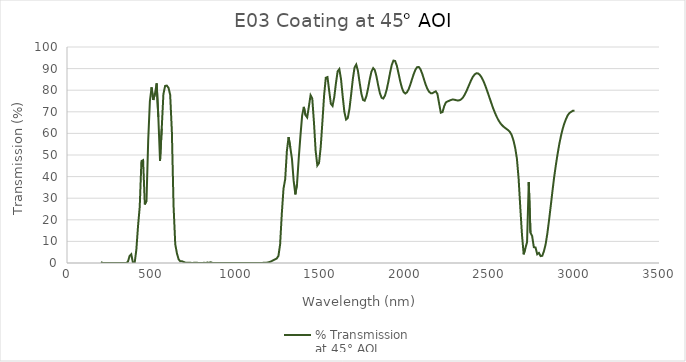
| Category | % Transmission 
at 45° AOI |
|---|---|
| 200.0 | 0.324 |
| 210.0 | 0.073 |
| 220.0 | 0.023 |
| 230.0 | 0.012 |
| 240.0 | 0.01 |
| 250.0 | 0.007 |
| 260.0 | 0.025 |
| 270.0 | 0.028 |
| 280.0 | 0.033 |
| 290.0 | 0.028 |
| 300.0 | 0.001 |
| 310.0 | 0.011 |
| 320.0 | 0.002 |
| 330.0 | 0.004 |
| 340.0 | 0.036 |
| 350.0 | 0.01 |
| 360.0 | 0.552 |
| 370.0 | 3.245 |
| 380.0 | 4.052 |
| 390.0 | 0.02 |
| 400.0 | 0.015 |
| 410.0 | 6.198 |
| 420.0 | 17.137 |
| 430.0 | 26.016 |
| 440.0 | 47.174 |
| 450.0 | 47.615 |
| 460.0 | 27.122 |
| 470.0 | 28.842 |
| 480.0 | 56.64 |
| 490.0 | 74.887 |
| 500.0 | 81.298 |
| 510.0 | 75.466 |
| 520.0 | 78.25 |
| 530.0 | 83.14 |
| 540.0 | 67.562 |
| 550.0 | 47.317 |
| 560.0 | 62.172 |
| 570.0 | 78.207 |
| 580.0 | 81.968 |
| 590.0 | 82.142 |
| 600.0 | 81.103 |
| 610.0 | 77.89 |
| 620.0 | 60.803 |
| 630.0 | 26.404 |
| 640.0 | 8.68 |
| 650.0 | 4.44 |
| 660.0 | 1.673 |
| 670.0 | 0.758 |
| 680.0 | 0.798 |
| 690.0 | 0.496 |
| 700.0 | 0.148 |
| 710.0 | 0.148 |
| 720.0 | 0.154 |
| 730.0 | 0.089 |
| 740.0 | 0.021 |
| 750.0 | 0.08 |
| 760.0 | 0.097 |
| 770.0 | 0.07 |
| 780.0 | 0.03 |
| 790.0 | 0.026 |
| 800.0 | 0.036 |
| 810.0 | 0.077 |
| 820.0 | 0.033 |
| 830.0 | 0.191 |
| 840.0 | 0.132 |
| 850.0 | 0.343 |
| 860.0 | 0.009 |
| 870.0 | 0.014 |
| 880.0 | 0.022 |
| 890.0 | 0.006 |
| 900.0 | 0.004 |
| 910.0 | 0.021 |
| 920.0 | 0.017 |
| 930.0 | 0.007 |
| 940.0 | 0.014 |
| 950.0 | 0.024 |
| 960.0 | 0.005 |
| 970.0 | 0.007 |
| 980.0 | 0.004 |
| 990.0 | 0.005 |
| 1000.0 | 0.007 |
| 1010.0 | 0.008 |
| 1020.0 | 0.008 |
| 1030.0 | 0.002 |
| 1040.0 | 0.016 |
| 1050.0 | 0.042 |
| 1060.0 | 0.031 |
| 1070.0 | 0.009 |
| 1080.0 | 0.009 |
| 1090.0 | 0.013 |
| 1100.0 | 0.014 |
| 1110.0 | 0.01 |
| 1120.0 | 0.01 |
| 1130.0 | 0.004 |
| 1140.0 | 0.013 |
| 1150.0 | 0.03 |
| 1160.0 | 0.065 |
| 1170.0 | 0.063 |
| 1180.0 | 0.149 |
| 1190.0 | 0.307 |
| 1200.0 | 0.5 |
| 1210.0 | 0.867 |
| 1220.0 | 1.297 |
| 1230.0 | 1.659 |
| 1240.0 | 2.09 |
| 1250.0 | 3.257 |
| 1260.0 | 8.653 |
| 1270.0 | 22.883 |
| 1280.0 | 34.416 |
| 1290.0 | 38.801 |
| 1300.0 | 51.844 |
| 1310.0 | 58.308 |
| 1320.0 | 53.588 |
| 1330.0 | 48.201 |
| 1340.0 | 38.112 |
| 1350.0 | 31.784 |
| 1360.0 | 36.624 |
| 1370.0 | 48.388 |
| 1380.0 | 58.756 |
| 1390.0 | 68.115 |
| 1400.0 | 72.288 |
| 1410.0 | 68.496 |
| 1420.0 | 67.382 |
| 1430.0 | 72.431 |
| 1440.0 | 77.674 |
| 1450.0 | 76.215 |
| 1460.0 | 65.184 |
| 1470.0 | 51.939 |
| 1480.0 | 45.139 |
| 1490.0 | 46.27 |
| 1500.0 | 53.688 |
| 1510.0 | 65.329 |
| 1520.0 | 77.53 |
| 1530.0 | 85.759 |
| 1540.0 | 86.086 |
| 1550.0 | 79.777 |
| 1560.0 | 73.725 |
| 1570.0 | 72.722 |
| 1580.0 | 76.715 |
| 1590.0 | 83.233 |
| 1600.0 | 88.738 |
| 1610.0 | 89.79 |
| 1620.0 | 85.148 |
| 1630.0 | 77.102 |
| 1640.0 | 69.909 |
| 1650.0 | 66.415 |
| 1660.0 | 67.109 |
| 1670.0 | 71.36 |
| 1680.0 | 78.077 |
| 1690.0 | 85.23 |
| 1700.0 | 90.478 |
| 1710.0 | 91.879 |
| 1720.0 | 88.958 |
| 1730.0 | 83.602 |
| 1740.0 | 78.56 |
| 1750.0 | 75.52 |
| 1760.0 | 75.147 |
| 1770.0 | 77.209 |
| 1780.0 | 80.836 |
| 1790.0 | 85.075 |
| 1800.0 | 88.658 |
| 1810.0 | 90.241 |
| 1820.0 | 89.291 |
| 1830.0 | 86.207 |
| 1840.0 | 82.146 |
| 1850.0 | 78.611 |
| 1860.0 | 76.495 |
| 1870.0 | 76.148 |
| 1880.0 | 77.512 |
| 1890.0 | 80.248 |
| 1900.0 | 83.94 |
| 1910.0 | 88.07 |
| 1920.0 | 91.708 |
| 1930.0 | 93.7 |
| 1940.0 | 93.522 |
| 1950.0 | 91.329 |
| 1960.0 | 87.83 |
| 1970.0 | 84.156 |
| 1980.0 | 81.108 |
| 1990.0 | 79.145 |
| 2000.0 | 78.475 |
| 2010.0 | 79.018 |
| 2020.0 | 80.492 |
| 2030.0 | 82.631 |
| 2040.0 | 85.131 |
| 2050.0 | 87.539 |
| 2060.0 | 89.496 |
| 2070.0 | 90.668 |
| 2080.0 | 90.74 |
| 2090.0 | 89.641 |
| 2100.0 | 87.664 |
| 2110.0 | 85.163 |
| 2120.0 | 82.693 |
| 2130.0 | 80.704 |
| 2140.0 | 79.352 |
| 2150.0 | 78.631 |
| 2160.0 | 78.595 |
| 2170.0 | 79.085 |
| 2180.0 | 79.481 |
| 2190.0 | 78.268 |
| 2200.0 | 73.873 |
| 2210.0 | 69.592 |
| 2220.0 | 69.858 |
| 2230.0 | 72.602 |
| 2240.0 | 74.353 |
| 2250.0 | 74.821 |
| 2260.0 | 75.106 |
| 2270.0 | 75.475 |
| 2280.0 | 75.686 |
| 2290.0 | 75.612 |
| 2300.0 | 75.383 |
| 2310.0 | 75.23 |
| 2320.0 | 75.333 |
| 2330.0 | 75.751 |
| 2340.0 | 76.521 |
| 2350.0 | 77.735 |
| 2360.0 | 79.302 |
| 2370.0 | 81.093 |
| 2380.0 | 82.957 |
| 2390.0 | 84.739 |
| 2400.0 | 86.249 |
| 2410.0 | 87.281 |
| 2420.0 | 87.813 |
| 2430.0 | 87.774 |
| 2440.0 | 87.159 |
| 2450.0 | 86.052 |
| 2460.0 | 84.593 |
| 2470.0 | 82.732 |
| 2480.0 | 80.59 |
| 2490.0 | 78.343 |
| 2500.0 | 76.054 |
| 2510.0 | 73.738 |
| 2520.0 | 71.51 |
| 2530.0 | 69.527 |
| 2540.0 | 67.764 |
| 2550.0 | 66.217 |
| 2560.0 | 64.958 |
| 2570.0 | 63.964 |
| 2580.0 | 63.188 |
| 2590.0 | 62.542 |
| 2600.0 | 61.981 |
| 2610.0 | 61.378 |
| 2620.0 | 60.523 |
| 2630.0 | 59.053 |
| 2640.0 | 56.604 |
| 2650.0 | 53.219 |
| 2660.0 | 48.256 |
| 2670.0 | 39.123 |
| 2680.0 | 25.604 |
| 2690.0 | 13.006 |
| 2700.0 | 4.002 |
| 2710.0 | 6.818 |
| 2720.0 | 9.701 |
| 2730.0 | 37.457 |
| 2740.0 | 14.068 |
| 2750.0 | 12.496 |
| 2760.0 | 7.335 |
| 2770.0 | 7.18 |
| 2780.0 | 4.051 |
| 2790.0 | 4.676 |
| 2800.0 | 3.194 |
| 2810.0 | 3.352 |
| 2820.0 | 5.528 |
| 2830.0 | 8.772 |
| 2840.0 | 13.745 |
| 2850.0 | 19.824 |
| 2860.0 | 26.445 |
| 2870.0 | 33.204 |
| 2880.0 | 39.659 |
| 2890.0 | 45.22 |
| 2900.0 | 50.254 |
| 2910.0 | 54.83 |
| 2920.0 | 58.686 |
| 2930.0 | 61.962 |
| 2940.0 | 64.556 |
| 2950.0 | 66.619 |
| 2960.0 | 68.317 |
| 2970.0 | 69.395 |
| 2980.0 | 69.927 |
| 2990.0 | 70.469 |
| 3000.0 | 70.45 |